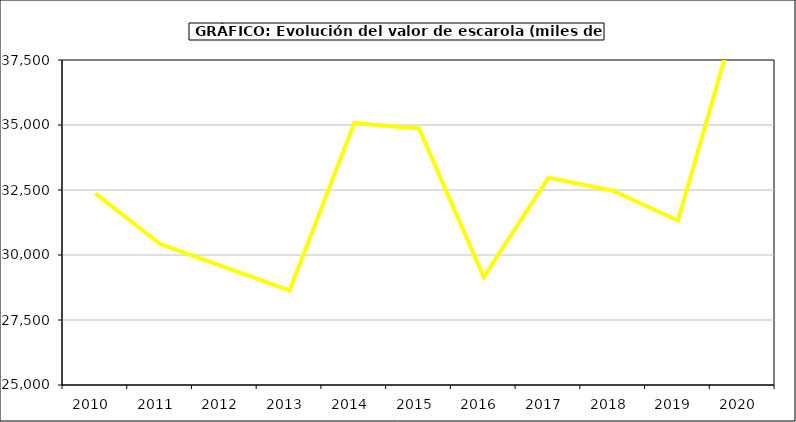
| Category | Valor |
|---|---|
| 2010.0 | 32371.364 |
| 2011.0 | 30423.163 |
| 2012.0 | 29537.457 |
| 2013.0 | 28639.256 |
| 2014.0 | 35074.052 |
| 2015.0 | 34867 |
| 2016.0 | 29152 |
| 2017.0 | 32975.446 |
| 2018.0 | 32472.175 |
| 2019.0 | 31324.351 |
| 2020.0 | 39947.279 |